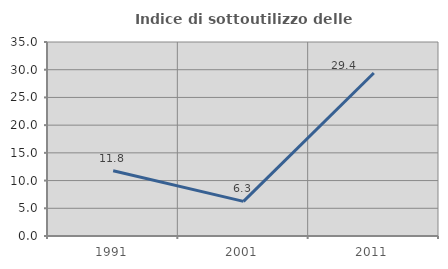
| Category | Indice di sottoutilizzo delle abitazioni  |
|---|---|
| 1991.0 | 11.765 |
| 2001.0 | 6.25 |
| 2011.0 | 29.412 |